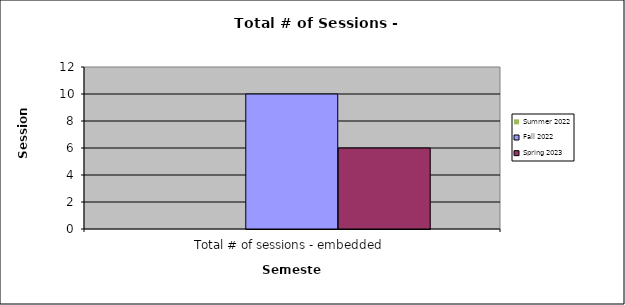
| Category | Summer 2022 | Fall 2022 | Spring 2023 |
|---|---|---|---|
| 0 | 0 | 10 | 6 |